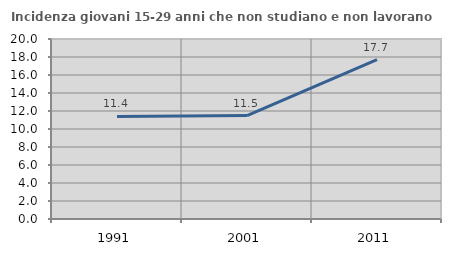
| Category | Incidenza giovani 15-29 anni che non studiano e non lavorano  |
|---|---|
| 1991.0 | 11.392 |
| 2001.0 | 11.494 |
| 2011.0 | 17.722 |